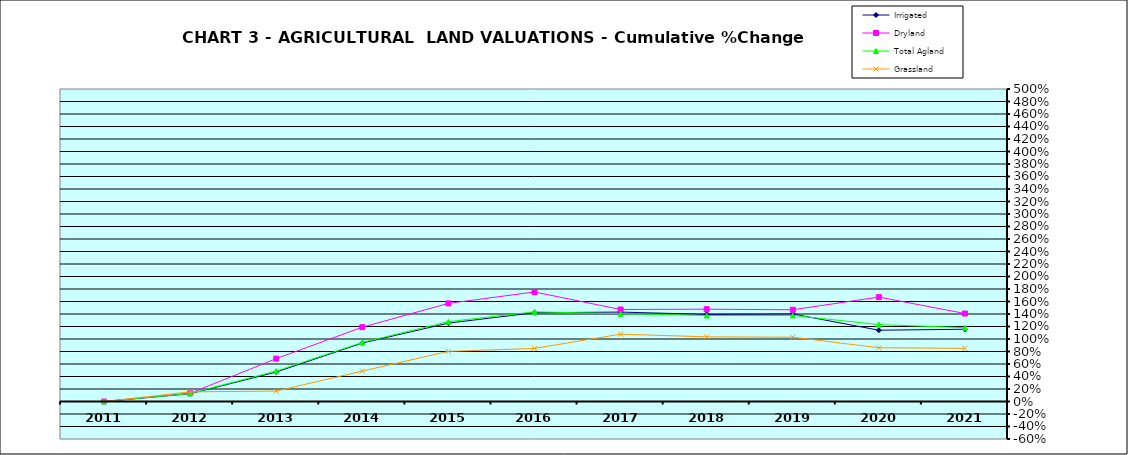
| Category | Irrigated | Dryland | Total Agland | Grassland |
|---|---|---|---|---|
| 2011.0 | 0 | 0 | 0 | 0 |
| 2012.0 | 0.124 | 0.132 | 0.129 | 0.154 |
| 2013.0 | 0.471 | 0.686 | 0.486 | 0.167 |
| 2014.0 | 0.936 | 1.189 | 0.945 | 0.486 |
| 2015.0 | 1.254 | 1.57 | 1.277 | 0.802 |
| 2016.0 | 1.42 | 1.752 | 1.435 | 0.849 |
| 2017.0 | 1.431 | 1.472 | 1.404 | 1.077 |
| 2018.0 | 1.394 | 1.477 | 1.376 | 1.035 |
| 2019.0 | 1.4 | 1.468 | 1.377 | 1.028 |
| 2020.0 | 1.141 | 1.671 | 1.23 | 0.86 |
| 2021.0 | 1.156 | 1.408 | 1.181 | 0.85 |